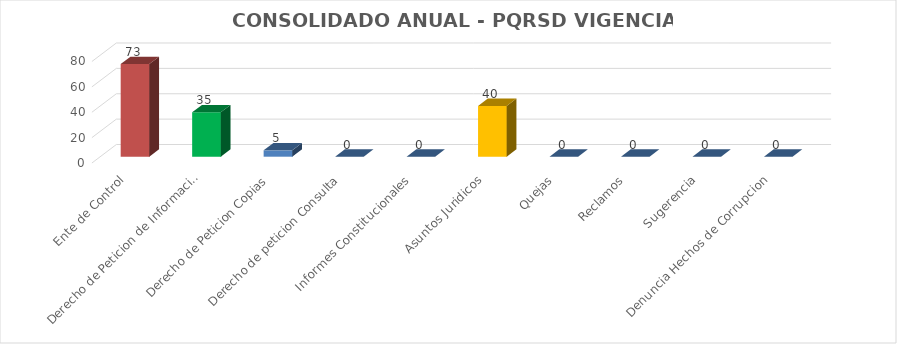
| Category | TOTALES |
|---|---|
| Ente de Control | 73 |
| Derecho de Peticion de Informacion | 35 |
| Derecho de Peticion Copias | 5 |
| Derecho de peticion Consulta | 0 |
| Informes Constitucionales | 0 |
| Asuntos Juridicos | 40 |
| Quejas | 0 |
| Reclamos | 0 |
| Sugerencia | 0 |
| Denuncia Hechos de Corrupcion | 0 |